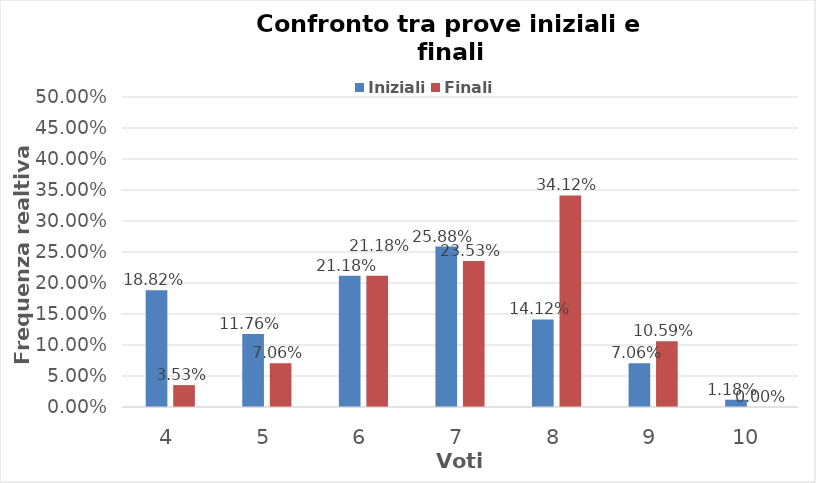
| Category | Iniziali | Finali |
|---|---|---|
| 4.0 | 0.188 | 0.035 |
| 5.0 | 0.118 | 0.071 |
| 6.0 | 0.212 | 0.212 |
| 7.0 | 0.259 | 0.235 |
| 8.0 | 0.141 | 0.341 |
| 9.0 | 0.071 | 0.106 |
| 10.0 | 0.012 | 0 |